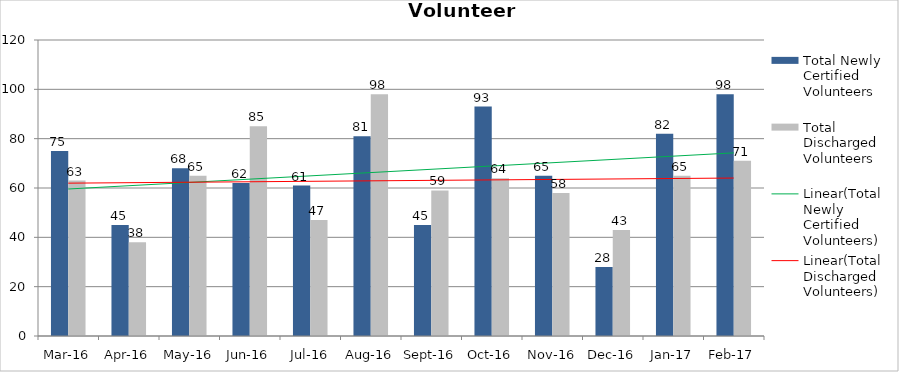
| Category | Total Newly Certified Volunteers | Total Discharged Volunteers |
|---|---|---|
| Mar-16 | 75 | 63 |
| Apr-16 | 45 | 38 |
| May-16 | 68 | 65 |
| Jun-16 | 62 | 85 |
| Jul-16 | 61 | 47 |
| Aug-16 | 81 | 98 |
| Sep-16 | 45 | 59 |
| Oct-16 | 93 | 64 |
| Nov-16 | 65 | 58 |
| Dec-16 | 28 | 43 |
| Jan-17 | 82 | 65 |
| Feb-17 | 98 | 71 |